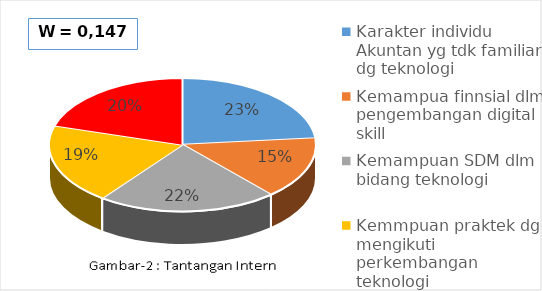
| Category | TANTANGAN INTERN |
|---|---|
| Karakter individu Akuntan yg tdk familiar dg teknologi | 0.234 |
| Kemampua finnsial dlm pengembangan digital skill | 0.151 |
| Kemampuan SDM dlm bidang teknologi | 0.218 |
| Kemmpuan praktek dg mengikuti perkembangan teknologi | 0.194 |
| Kurang memiliki kemampuan analisis big data | 0.203 |